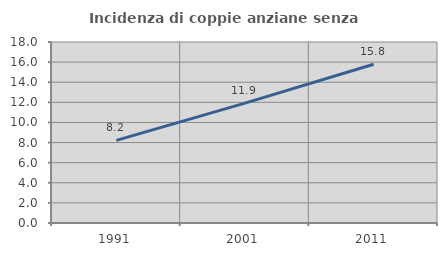
| Category | Incidenza di coppie anziane senza figli  |
|---|---|
| 1991.0 | 8.211 |
| 2001.0 | 11.917 |
| 2011.0 | 15.789 |